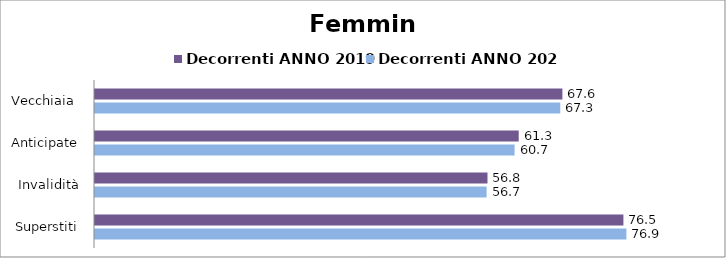
| Category | Decorrenti ANNO 2019 | Decorrenti ANNO 2020 |
|---|---|---|
| Vecchiaia  | 67.63 | 67.32 |
| Anticipate | 61.31 | 60.71 |
| Invalidità | 56.79 | 56.66 |
| Superstiti | 76.46 | 76.89 |